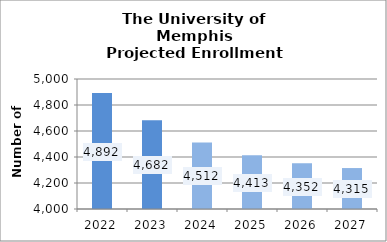
| Category | Series 0 |
|---|---|
| 2022.0 | 4892 |
| 2023.0 | 4682 |
| 2024.0 | 4512.123 |
| 2025.0 | 4413.064 |
| 2026.0 | 4351.961 |
| 2027.0 | 4314.994 |